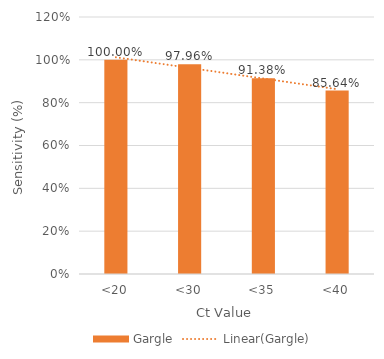
| Category | Gargle |
|---|---|
| <20 | 1 |
| <30 | 0.98 |
| <35 | 0.914 |
| <40 | 0.856 |